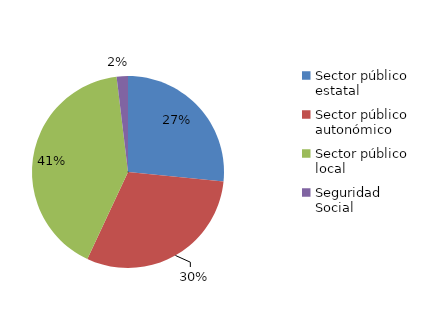
| Category | Series 0 |
|---|---|
| Sector público estatal | 42 |
| Sector público autonómico | 48 |
| Sector público local | 65 |
| Seguridad Social | 3 |